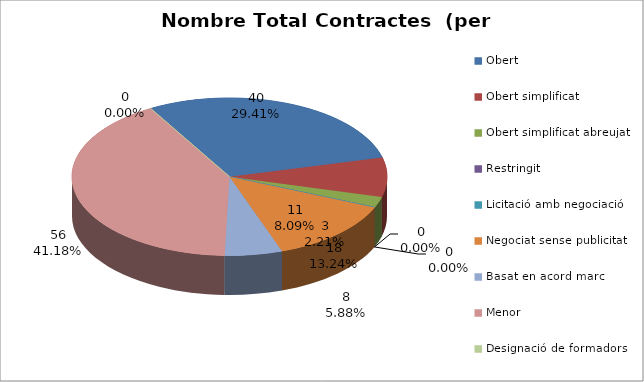
| Category | Nombre Total Contractes |
|---|---|
| Obert | 40 |
| Obert simplificat | 11 |
| Obert simplificat abreujat | 3 |
| Restringit | 0 |
| Licitació amb negociació | 0 |
| Negociat sense publicitat | 18 |
| Basat en acord marc | 8 |
| Menor | 56 |
| Designació de formadors | 0 |